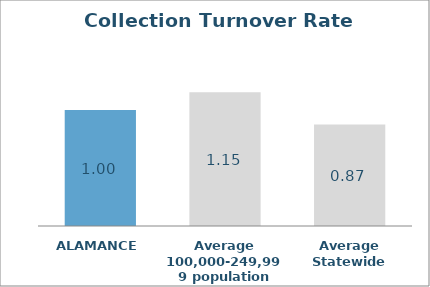
| Category | Series 0 |
|---|---|
| ALAMANCE | 0.996 |
| Average 100,000-249,999 population | 1.149 |
| Average Statewide | 0.871 |